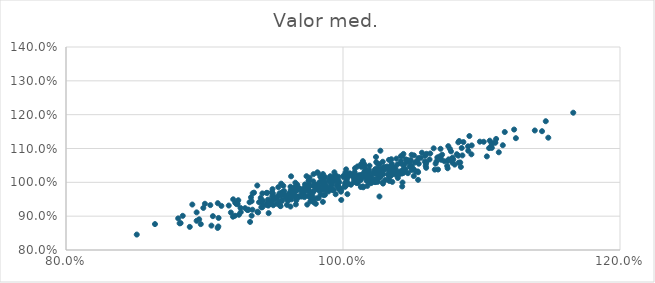
| Category | Valor med. |
|---|---|
| 1.0264534786792692 | 1.031 |
| 1.0480475107290632 | 1.047 |
| 1.0569857466015062 | 1.088 |
| 0.9833497521608179 | 1.001 |
| 1.0042333054086223 | 0.995 |
| 0.966968367408598 | 0.993 |
| 0.9526369422459644 | 0.953 |
| 0.9555273657762472 | 0.961 |
| 1.14822421754002 | 1.132 |
| 0.944422443159843 | 0.934 |
| 1.0662610147039522 | 1.038 |
| 0.8820367390134037 | 0.879 |
| 0.981511356670318 | 1.03 |
| 1.025337658208933 | 1.04 |
| 0.9780650731969343 | 0.947 |
| 0.9778279119440353 | 0.953 |
| 1.0625004386201649 | 1.068 |
| 0.8961620773664015 | 0.891 |
| 0.993491091010232 | 1.014 |
| 1.041738191199603 | 1.056 |
| 0.9410044940511771 | 0.926 |
| 1.0015046859051067 | 0.987 |
| 0.9958062230127026 | 0.993 |
| 1.1105555601961818 | 1.128 |
| 1.0600391536507343 | 1.06 |
| 1.098826228741906 | 1.12 |
| 1.112482511510789 | 1.089 |
| 0.9749625725006223 | 0.96 |
| 0.9862752821433973 | 0.987 |
| 0.9702521438141241 | 0.969 |
| 0.9611033353553384 | 0.967 |
| 0.9981397329742256 | 0.979 |
| 1.0496478634495572 | 1.048 |
| 0.985544778429729 | 1.024 |
| 1.0017738459032304 | 1.029 |
| 1.092707699523308 | 1.083 |
| 0.9790192057793661 | 0.975 |
| 0.989584970207292 | 0.973 |
| 0.9682319314257655 | 0.958 |
| 0.9205309207720864 | 0.898 |
| 0.9864523581291771 | 1.003 |
| 0.9987399943377335 | 0.948 |
| 0.9586079112930401 | 0.96 |
| 1.051091421445492 | 1.019 |
| 1.012026883191559 | 1.019 |
| 1.053486243141125 | 1.064 |
| 0.9736514727267841 | 1.018 |
| 0.9787492041481052 | 1.024 |
| 0.9963088293958351 | 0.999 |
| 1.0242447452204477 | 1.027 |
| 0.8943195235508155 | 0.886 |
| 1.0256617030207924 | 1.015 |
| 0.9521471199370422 | 0.937 |
| 1.0105696643095514 | 1.015 |
| 0.9387237251710628 | 0.911 |
| 1.0333481457441 | 1.015 |
| 1.1153825366574193 | 1.11 |
| 0.9662755922145602 | 0.946 |
| 1.0168659060184542 | 1.015 |
| 0.9925680904895495 | 0.977 |
| 0.9259615504498272 | 0.924 |
| 1.090273651412315 | 1.106 |
| 0.8973135540560573 | 0.876 |
| 0.9003054596133113 | 0.937 |
| 1.0128770136681042 | 1.007 |
| 0.9405968690308545 | 0.954 |
| 1.0784240921569848 | 1.067 |
| 0.9702406954635726 | 0.958 |
| 1.0172169825221162 | 1.004 |
| 1.0732409761433115 | 1.062 |
| 1.0184186412627345 | 1.029 |
| 1.0494800104917605 | 1.036 |
| 0.9672612446149794 | 0.987 |
| 1.0238785988288623 | 1.038 |
| 0.9417541551259251 | 0.926 |
| 1.05971373097298 | 1.049 |
| 0.9818050987922844 | 1.028 |
| 0.9778908043724791 | 0.96 |
| 1.039310581315858 | 1.053 |
| 0.9625115072728366 | 0.966 |
| 1.0290682345101678 | 1.024 |
| 1.0542351563606394 | 1.03 |
| 0.889364343429806 | 0.868 |
| 1.0784432033936993 | 1.069 |
| 1.0360497744388502 | 1.046 |
| 0.9578471803711148 | 0.962 |
| 1.0525162869742573 | 1.032 |
| 1.0292605236816015 | 1.043 |
| 1.0334617040800522 | 1.004 |
| 0.9616618176018781 | 0.958 |
| 1.0832035812543048 | 1.079 |
| 0.9561927230072029 | 0.948 |
| 1.0057828018869137 | 0.993 |
| 1.0297818502948062 | 1.046 |
| 1.034034801563227 | 1.034 |
| 0.9319154591955165 | 0.919 |
| 0.9862105812263267 | 0.98 |
| 1.0448265246015507 | 1.039 |
| 0.9657165549086134 | 0.974 |
| 0.9620986518494952 | 0.928 |
| 1.0266875283149763 | 1.015 |
| 0.923133466664514 | 0.936 |
| 0.9702301834507252 | 0.98 |
| 0.9060674848894299 | 0.9 |
| 1.0832575504755588 | 1.118 |
| 0.9347920256356882 | 0.968 |
| 1.1054815407671827 | 1.101 |
| 0.9976275119432858 | 0.984 |
| 1.105961387207916 | 1.123 |
| 1.0331859971155528 | 1.066 |
| 0.9293136723366925 | 0.924 |
| 0.9911850797869689 | 0.99 |
| 1.0101340036839055 | 1.009 |
| 1.0510519716787734 | 1.039 |
| 1.028909665920275 | 0.996 |
| 1.0168697017000863 | 1.012 |
| 1.0263177726275958 | 0.958 |
| 1.020411719633837 | 1.006 |
| 1.0686046470569137 | 1.038 |
| 0.9985506537358928 | 0.972 |
| 0.9824113487107946 | 0.954 |
| 1.006534407712121 | 1.02 |
| 1.0519810411824695 | 1.059 |
| 0.9785995024182491 | 1.003 |
| 1.0704154502533862 | 1.099 |
| 1.007125783836577 | 1.021 |
| 0.9741789193791062 | 0.934 |
| 1.1235547324469608 | 1.156 |
| 1.0835190844833678 | 1.058 |
| 1.002410029462621 | 1.003 |
| 0.9939889608797531 | 1.019 |
| 1.0106621495951753 | 1.011 |
| 0.9803836730922663 | 0.937 |
| 0.9447509798092738 | 0.969 |
| 0.9784222748790053 | 0.951 |
| 1.0668544076322035 | 1.055 |
| 1.03324127994667 | 1.036 |
| 0.9827776273106476 | 0.998 |
| 0.9559393589984283 | 0.971 |
| 1.0194420554272612 | 1 |
| 1.0219838904479033 | 1.027 |
| 1.0151955991333712 | 1.019 |
| 0.9749911717377985 | 0.985 |
| 1.0150185494377733 | 1.055 |
| 0.9898429516842272 | 1.004 |
| 0.9312100701101315 | 0.919 |
| 1.0435329432999874 | 1.051 |
| 0.8842863806291162 | 0.901 |
| 1.0857287155140576 | 1.101 |
| 1.056150124346454 | 1.072 |
| 0.9099895949843185 | 0.87 |
| 1.0869339026580735 | 1.119 |
| 0.9122119031564926 | 0.93 |
| 0.972560358114149 | 0.994 |
| 0.9919104939709441 | 0.993 |
| 0.9754860258107709 | 0.994 |
| 1.0468647677520302 | 1.027 |
| 0.9595337471395464 | 0.933 |
| 1.0028180342829165 | 1.009 |
| 0.9867730400501536 | 0.991 |
| 1.0117990789383378 | 1.021 |
| 1.0199230963219361 | 1.016 |
| 1.0328883240310187 | 1.041 |
| 1.0107598526832764 | 1.02 |
| 0.9849931960348061 | 1 |
| 0.9221708121328143 | 0.94 |
| 1.1662509098583382 | 1.206 |
| 0.9752208806518529 | 1.005 |
| 0.9960928981294065 | 1.002 |
| 1.1016251330680853 | 1.12 |
| 1.0264270637205948 | 1.054 |
| 1.0495394890812362 | 1.081 |
| 1.0755607014660176 | 1.042 |
| 0.9493856708704045 | 0.967 |
| 0.9095892008763439 | 0.938 |
| 1.0821596111667633 | 1.083 |
| 0.9535324806027613 | 0.943 |
| 0.9620917812120462 | 0.987 |
| 1.0376255547407864 | 1.023 |
| 0.8510936260569688 | 0.846 |
| 1.0862098613487385 | 1.08 |
| 1.0104798100951633 | 1.018 |
| 1.0270026086433572 | 1.093 |
| 1.0031826066117249 | 0.965 |
| 0.8827551213686935 | 0.88 |
| 0.9566316483016442 | 0.971 |
| 0.9615513311287788 | 0.951 |
| 0.9393749635155008 | 0.941 |
| 0.9335592007496407 | 0.956 |
| 0.9880737410432734 | 0.988 |
| 1.031818552469312 | 1.047 |
| 1.0293918534585877 | 1.04 |
| 0.9877538487184571 | 0.982 |
| 0.9491030378867773 | 0.98 |
| 1.1248348562007844 | 1.131 |
| 1.110007797634724 | 1.117 |
| 1.070492899613825 | 1.075 |
| 1.015602984012034 | 1.05 |
| 1.028048263462158 | 1.026 |
| 1.0482907262762675 | 1.06 |
| 0.9694637080303761 | 0.959 |
| 0.9828776384358164 | 0.976 |
| 1.0080475530635769 | 1.001 |
| 1.0602847026632587 | 1.084 |
| 1.014311887219639 | 1.018 |
| 0.9923613292415836 | 0.978 |
| 0.9720352149189799 | 0.982 |
| 1.000533049988478 | 1.015 |
| 1.0904240919999193 | 1.093 |
| 1.0232655911272062 | 1.031 |
| 1.0274101513789657 | 1.04 |
| 0.9915020426600377 | 0.983 |
| 1.0779802535534984 | 1.092 |
| 1.0752359353219987 | 1.048 |
| 1.0176829651662875 | 1.028 |
| 0.9248768402146454 | 0.904 |
| 1.0014458690933583 | 0.99 |
| 1.017476887544958 | 1.015 |
| 1.0249919657142075 | 1.001 |
| 0.9867232925416365 | 1 |
| 1.0440939367871513 | 1.032 |
| 1.0334685891937763 | 1.031 |
| 0.9906676023092991 | 1.009 |
| 0.9916883637928579 | 1.014 |
| 0.9357576278198071 | 0.97 |
| 1.036924562413436 | 1.033 |
| 1.0388730102982282 | 1.025 |
| 0.9500881230688113 | 0.949 |
| 1.0428530747214722 | 1.078 |
| 1.01144658838364 | 1.009 |
| 1.0487599072375324 | 1.045 |
| 0.9972906930535177 | 1 |
| 1.0133583372072603 | 1.046 |
| 0.9575560228680321 | 0.974 |
| 1.0278396145462287 | 1.024 |
| 1.0542043133977215 | 1.007 |
| 0.9653964811111253 | 0.981 |
| 0.9756205856225847 | 0.975 |
| 1.022198764944713 | 1.026 |
| 1.0790059195219208 | 1.058 |
| 0.9458404508878673 | 0.949 |
| 0.9454853838278654 | 0.941 |
| 1.0003268107734837 | 1.019 |
| 1.0235078935456146 | 1.025 |
| 0.9860495269907615 | 1.014 |
| 0.9557588467024071 | 0.944 |
| 0.9381059173935532 | 0.991 |
| 0.96269820834806 | 0.95 |
| 1.0436301604179563 | 1.084 |
| 0.9460530687487796 | 0.931 |
| 1.0231782075838824 | 1.036 |
| 1.1464053611753782 | 1.181 |
| 0.9417699659217812 | 0.967 |
| 0.9495255204391635 | 0.949 |
| 0.9710056048837663 | 0.975 |
| 1.1038681593327737 | 1.077 |
| 0.9946677902597262 | 1.006 |
| 0.9346415484307093 | 0.919 |
| 0.9684057227650028 | 0.958 |
| 1.0349945816619635 | 1.051 |
| 0.972253771249506 | 0.956 |
| 1.068094235704265 | 1.073 |
| 0.9545200335373482 | 0.931 |
| 1.0086659695987543 | 1.042 |
| 0.9873507120315734 | 1.015 |
| 1.1167927344515935 | 1.149 |
| 1.0238247125233615 | 1.075 |
| 0.9190535080357195 | 0.911 |
| 0.9659708654050426 | 0.935 |
| 0.8943279118829681 | 0.911 |
| 0.9837766396331251 | 0.964 |
| 1.0287232379051372 | 1.061 |
| 1.0850955378907208 | 1.045 |
| 0.926178037692202 | 0.912 |
| 0.9340355486887639 | 0.902 |
| 1.0846607324384048 | 1.059 |
| 0.9532824222059687 | 0.986 |
| 1.017584801825131 | 0.989 |
| 0.9854767230052304 | 0.942 |
| 1.0260992425705742 | 1.033 |
| 0.9309127776319972 | 0.918 |
| 1.0466007971823628 | 1.066 |
| 0.9611014053880967 | 0.953 |
| 0.994695582060796 | 0.965 |
| 0.8912004220815795 | 0.934 |
| 0.9856054564127197 | 0.99 |
| 0.9662929116414927 | 0.976 |
| 0.9488662107862138 | 0.958 |
| 1.020386122916634 | 1.014 |
| 0.9472899853879742 | 0.943 |
| 0.9890348716741689 | 0.982 |
| 1.0142281367789356 | 1.024 |
| 0.9243881001240154 | 0.947 |
| 0.9870530737301982 | 0.963 |
| 1.0285888676976804 | 1 |
| 0.9810179643101629 | 0.953 |
| 0.952836783056347 | 0.959 |
| 0.9569335929664393 | 0.99 |
| 1.1384827647743632 | 1.153 |
| 0.9758357329114236 | 1.014 |
| 0.9925755354299983 | 1.006 |
| 1.048889665804631 | 1.066 |
| 0.9721686023574366 | 0.96 |
| 1.0436930731143095 | 1.037 |
| 1.0254879549717795 | 1.011 |
| 1.0067101271456782 | 1.022 |
| 1.0386822718859214 | 1.025 |
| 1.0377133217027343 | 1.043 |
| 1.0247461809723002 | 1.038 |
| 0.9846597183287265 | 0.976 |
| 1.0157914026658112 | 1.033 |
| 1.0771320961084938 | 1.099 |
| 0.9340202662892809 | 0.944 |
| 1.0266430178733292 | 1.027 |
| 0.9945793897554537 | 1.021 |
| 0.9793201849344818 | 0.989 |
| 0.9496473377533748 | 0.932 |
| 0.9765033222247506 | 0.963 |
| 1.0435446565205952 | 1.028 |
| 1.025570854702635 | 1.027 |
| 1.1074475043682492 | 1.102 |
| 1.0912583259665816 | 1.137 |
| 0.8809953418919967 | 0.893 |
| 1.0600355648554831 | 1.043 |
| 1.0395766163547857 | 1.013 |
| 1.0760249716262607 | 1.107 |
| 0.9932399696213083 | 0.978 |
| 1.0791821836336875 | 1.073 |
| 0.9468438632642978 | 0.941 |
| 0.9668183052463658 | 0.99 |
| 1.0018215398941348 | 0.989 |
| 1.0929427747235152 | 1.109 |
| 1.01316071187903 | 1.054 |
| 0.9207175129721207 | 0.95 |
| 0.9419680577948238 | 0.934 |
| 0.9744276419802551 | 0.988 |
| 0.9175012233315051 | 0.931 |
| 0.9717075675470666 | 0.969 |
| 1.0133888513215594 | 1.015 |
| 1.027292488458583 | 1.018 |
| 0.9967273390696683 | 1.006 |
| 1.009038469477069 | 1.002 |
| 1.054503680007475 | 1.072 |
| 0.9758747431104562 | 0.957 |
| 0.9861688582174288 | 0.962 |
| 1.043219975322084 | 1.037 |
| 1.0599787174243194 | 1.056 |
| 1.0763132871649126 | 1.068 |
| 1.044718031807855 | 1.037 |
| 0.9816510248689371 | 0.987 |
| 1.0033243259738232 | 1.024 |
| 1.0367965863109252 | 1.043 |
| 1.014331379237972 | 0.988 |
| 1.1070449118251018 | 1.107 |
| 0.9835880227637086 | 1.017 |
| 0.9955996784850423 | 0.989 |
| 0.9381885009715017 | 0.913 |
| 1.0128746870536598 | 0.986 |
| 1.0190653091307675 | 1.036 |
| 0.9473316987649355 | 0.936 |
| 1.037829543219086 | 1.038 |
| 0.9988355851075102 | 0.979 |
| 0.972917207487598 | 0.989 |
| 0.909520369793634 | 0.865 |
| 0.9798626279547833 | 0.994 |
| 0.9629866997508467 | 0.974 |
| 0.9812502543901148 | 0.982 |
| 0.9648627478452753 | 0.964 |
| 0.9964150791309885 | 0.99 |
| 0.9804188561707977 | 0.991 |
| 1.0357637730851288 | 1.025 |
| 0.9937750457250417 | 1.03 |
| 1.0439805000765352 | 1.052 |
| 1.007597412731383 | 1.014 |
| 1.03944471757385 | 1.027 |
| 0.9631938402295028 | 0.962 |
| 0.9675391446285768 | 0.957 |
| 0.9628321997789915 | 0.975 |
| 0.8991468015614378 | 0.924 |
| 1.0590856912055424 | 1.061 |
| 1.03452785315369 | 1.019 |
| 1.0229157833282205 | 1.001 |
| 1.1437025674510175 | 1.151 |
| 1.014363497347232 | 1.063 |
| 1.0355837367232972 | 1.001 |
| 1.0242703114548606 | 1.025 |
| 1.0107359104513924 | 0.998 |
| 1.046028124080687 | 1.059 |
| 1.0796119581963315 | 1.067 |
| 0.9329103869661046 | 0.883 |
| 1.0014995953584662 | 0.998 |
| 1.023354393563934 | 1.039 |
| 0.9496693841400945 | 0.959 |
| 1.0038502411047359 | 1.017 |
| 0.9553665025408795 | 0.996 |
| 0.9970019359493792 | 0.98 |
| 1.0417828940045 | 1.077 |
| 1.0231817649480026 | 1.037 |
| 1.035526406051263 | 1.032 |
| 0.9929774034121591 | 1.002 |
| 0.9713856097789435 | 0.959 |
| 0.9590025110532201 | 0.953 |
| 0.990777078981551 | 1.018 |
| 0.9785224301350253 | 0.972 |
| 0.9496548460259601 | 0.951 |
| 0.9463113113611996 | 0.909 |
| 0.9821527292714829 | 0.978 |
| 1.0438794634817972 | 1.031 |
| 1.0077340582006804 | 1.023 |
| 1.0423502965156668 | 1.026 |
| 0.9652787535483229 | 0.983 |
| 0.9485646173685319 | 0.971 |
| 1.0022854669695822 | 1.038 |
| 1.0838667958298471 | 1.122 |
| 1.0128729046245712 | 1.021 |
| 0.968207104914641 | 0.982 |
| 1.0352051863973184 | 1.055 |
| 1.053952911459334 | 1.032 |
| 0.9652729868797535 | 0.956 |
| 1.062993813055276 | 1.085 |
| 0.9239176493153195 | 0.936 |
| 0.9854209098466691 | 1.012 |
| 1.0325544854401825 | 1.023 |
| 1.0191417190964411 | 1.049 |
| 0.9743176052224922 | 0.975 |
| 1.075610413825678 | 1.064 |
| 1.038553742822482 | 1.07 |
| 1.0203486109001865 | 0.998 |
| 1.0240030260232797 | 1.06 |
| 0.9622466454742582 | 0.977 |
| 0.9671099767525406 | 0.958 |
| 1.0105143764476092 | 1.047 |
| 0.9541361695246529 | 0.968 |
| 0.9601789181934218 | 0.945 |
| 1.0233632277428597 | 1.001 |
| 0.9871958811679808 | 0.996 |
| 0.9421114536688152 | 0.946 |
| 0.9325207955619516 | 0.941 |
| 1.0162976473482472 | 1.041 |
| 1.0403369945070013 | 1.023 |
| 1.107422022276798 | 1.115 |
| 0.9881995255412983 | 0.976 |
| 1.0405171541492013 | 1.032 |
| 0.9050068099648635 | 0.872 |
| 1.0427331626580922 | 0.988 |
| 0.9858645381964921 | 0.996 |
| 0.9831212288316165 | 0.978 |
| 0.979211813313162 | 0.94 |
| 0.962227899319799 | 0.969 |
| 1.0155950755336625 | 1.032 |
| 0.9751502888453369 | 0.985 |
| 1.0429666152962813 | 1 |
| 0.9752973531061672 | 1.005 |
| 1.0080859263440154 | 1.006 |
| 1.1095227266317529 | 1.118 |
| 0.9678986591940829 | 0.978 |
| 0.9784662060772628 | 0.99 |
| 1.0084033166674173 | 1.03 |
| 1.0305387488287225 | 1.007 |
| 0.9042065682589256 | 0.933 |
| 0.9649251715806431 | 0.985 |
| 1.0295991803047486 | 1.036 |
| 1.0249875147256702 | 1.055 |
| 0.9669669243197749 | 0.954 |
| 1.0547052473414547 | 1.055 |
| 0.9542151264682833 | 0.962 |
| 1.0192210253003722 | 1.02 |
| 1.0049779760689093 | 1.027 |
| 0.996735686857192 | 1.016 |
| 1.034893098105081 | 1.068 |
| 1.0417854853770185 | 1.062 |
| 1.0146623678338635 | 0.985 |
| 1.0117656641900448 | 1.009 |
| 1.0675279839813525 | 1.062 |
| 0.9453213645918578 | 0.969 |
| 1.051225809097018 | 1.08 |
| 1.0098797102074266 | 0.998 |
| 1.0806203867305808 | 1.052 |
| 0.9656074859453351 | 0.999 |
| 1.0110453323021076 | 1.019 |
| 0.9911775687883754 | 0.998 |
| 0.9549879838597841 | 0.93 |
| 1.0694209629033615 | 1.076 |
| 1.0654662219575632 | 1.101 |
| 0.9829839936254129 | 0.987 |
| 1.0709430336099994 | 1.067 |
| 0.8642465948412077 | 0.877 |
| 0.975551831560877 | 0.989 |
| 0.9716863260980169 | 0.973 |
| 0.9219835648020577 | 0.901 |
| 1.0225327419007484 | 1.009 |
| 1.045329661288873 | 1.068 |
| 0.9485581214819003 | 0.937 |
| 1.0239174925391927 | 1.007 |
| 1.0715665088521538 | 1.082 |
| 0.910158942800548 | 0.895 |
| 0.9764021661541491 | 0.944 |
| 1.0139667049299657 | 1.015 |
| 1.0592860043290842 | 1.078 |
| 0.9625302705683946 | 1.018 |